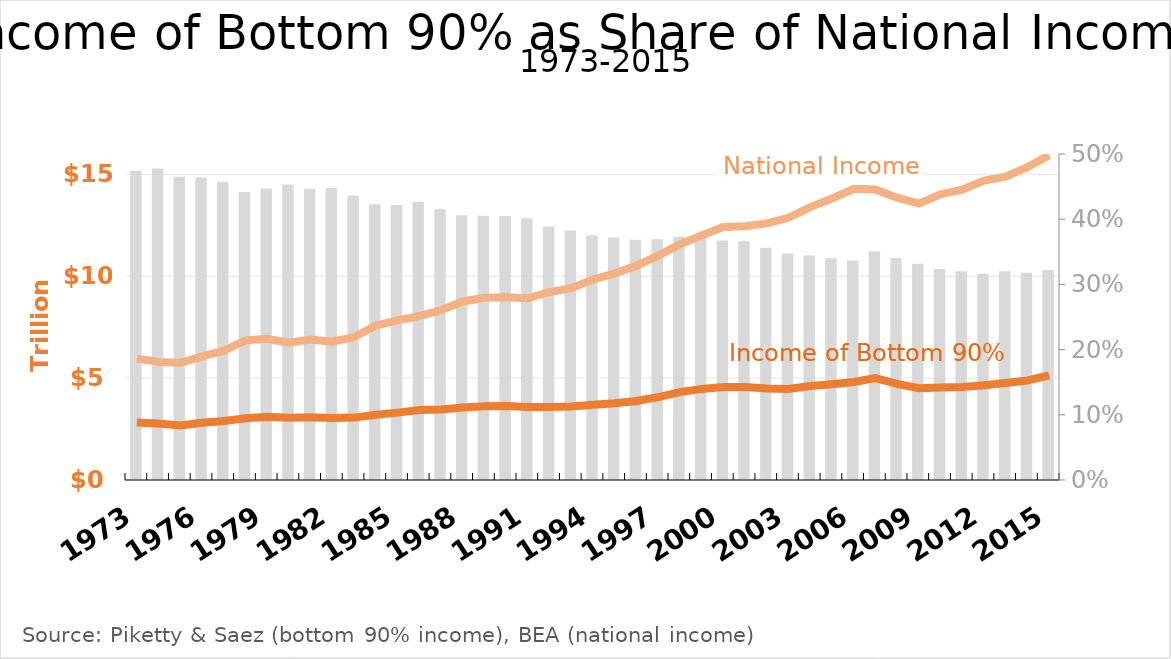
| Category | Series 2 |
|---|---|
| 0 | 0.474 |
| 1 | 0.478 |
| 2 | 0.465 |
| 3 | 0.464 |
| 4 | 0.457 |
| 5 | 0.442 |
| 6 | 0.447 |
| 7 | 0.453 |
| 8 | 0.447 |
| 9 | 0.448 |
| 10 | 0.436 |
| 11 | 0.423 |
| 12 | 0.422 |
| 13 | 0.427 |
| 14 | 0.415 |
| 15 | 0.406 |
| 16 | 0.405 |
| 17 | 0.405 |
| 18 | 0.401 |
| 19 | 0.389 |
| 20 | 0.383 |
| 21 | 0.375 |
| 22 | 0.372 |
| 23 | 0.368 |
| 24 | 0.369 |
| 25 | 0.373 |
| 26 | 0.373 |
| 27 | 0.367 |
| 28 | 0.366 |
| 29 | 0.356 |
| 30 | 0.348 |
| 31 | 0.344 |
| 32 | 0.34 |
| 33 | 0.337 |
| 34 | 0.35 |
| 35 | 0.341 |
| 36 | 0.332 |
| 37 | 0.324 |
| 38 | 0.32 |
| 39 | 0.316 |
| 40 | 0.32 |
| 41 | 0.318 |
| 42 | 0.322 |